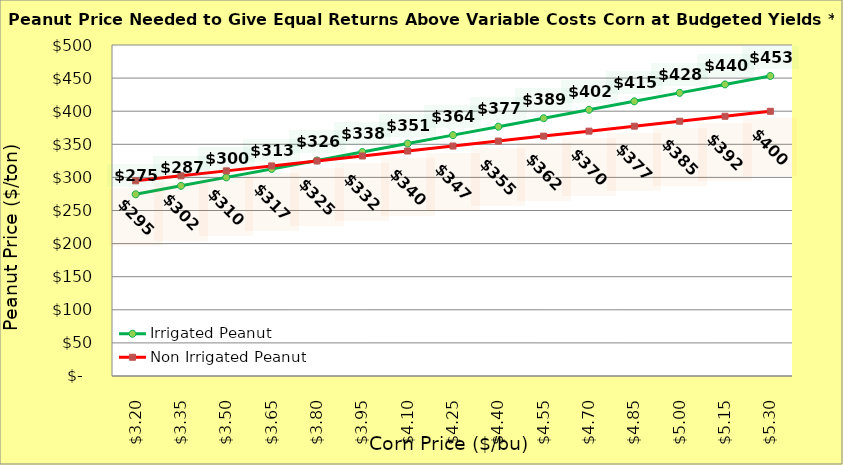
| Category | Irrigated Peanut | Non Irrigated Peanut |
|---|---|---|
| 3.2 | 274.504 | 294.865 |
| 3.35 | 287.27 | 302.365 |
| 3.5 | 300.036 | 309.865 |
| 3.65 | 312.802 | 317.365 |
| 3.8 | 325.568 | 324.865 |
| 3.9499999999999997 | 338.334 | 332.365 |
| 4.1 | 351.1 | 339.865 |
| 4.25 | 363.866 | 347.365 |
| 4.4 | 376.632 | 354.865 |
| 4.550000000000001 | 389.398 | 362.365 |
| 4.700000000000001 | 402.164 | 369.865 |
| 4.850000000000001 | 414.93 | 377.365 |
| 5.000000000000002 | 427.696 | 384.865 |
| 5.150000000000002 | 440.462 | 392.365 |
| 5.3000000000000025 | 453.228 | 399.865 |